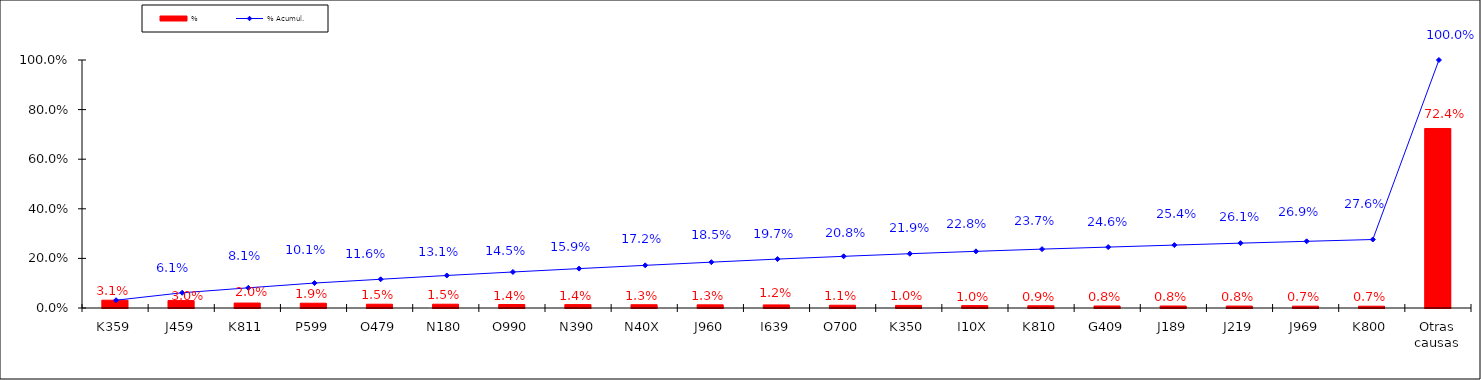
| Category | % |
|---|---|
| K359 | 0.031 |
| J459 | 0.03 |
| K811 | 0.02 |
| P599 | 0.019 |
| O479 | 0.015 |
| N180 | 0.015 |
| O990 | 0.014 |
| N390 | 0.014 |
| N40X | 0.013 |
| J960 | 0.013 |
| I639 | 0.012 |
| O700 | 0.011 |
| K350 | 0.01 |
| I10X | 0.01 |
| K810 | 0.009 |
| G409 | 0.008 |
| J189 | 0.008 |
| J219 | 0.008 |
| J969 | 0.007 |
| K800 | 0.007 |
| Otras causas | 0.724 |